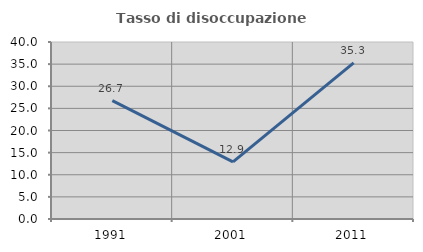
| Category | Tasso di disoccupazione giovanile  |
|---|---|
| 1991.0 | 26.744 |
| 2001.0 | 12.903 |
| 2011.0 | 35.294 |